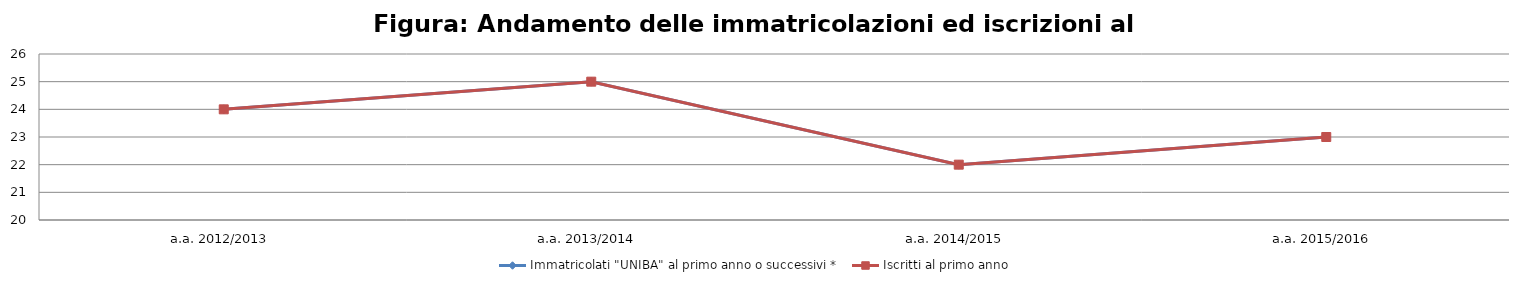
| Category | Immatricolati "UNIBA" al primo anno o successivi * | Iscritti al primo anno  |
|---|---|---|
| a.a. 2012/2013 | 24 | 24 |
| a.a. 2013/2014 | 25 | 25 |
| a.a. 2014/2015 | 22 | 22 |
| a.a. 2015/2016 | 23 | 23 |